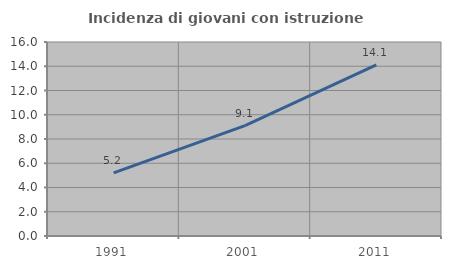
| Category | Incidenza di giovani con istruzione universitaria |
|---|---|
| 1991.0 | 5.21 |
| 2001.0 | 9.11 |
| 2011.0 | 14.112 |